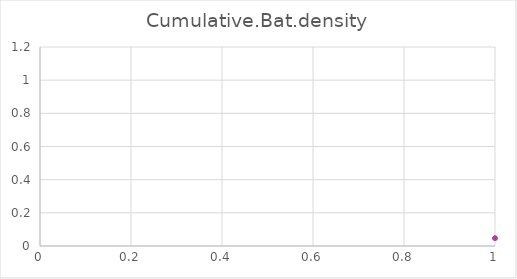
| Category | Cumulative.Bat.density |
|---|---|
| 0 | 0.047 |
| 1 | 0.091 |
| 2 | 0.132 |
| 3 | 0.171 |
| 4 | 0.206 |
| 5 | 0.239 |
| 6 | 0.269 |
| 7 | 0.297 |
| 8 | 0.323 |
| 9 | 0.347 |
| 10 | 0.369 |
| 11 | 0.389 |
| 12 | 0.408 |
| 13 | 0.425 |
| 14 | 0.442 |
| 15 | 0.457 |
| 16 | 0.471 |
| 17 | 0.485 |
| 18 | 0.498 |
| 19 | 0.511 |
| 20 | 0.523 |
| 21 | 0.536 |
| 22 | 0.548 |
| 23 | 0.56 |
| 24 | 0.573 |
| 25 | 0.586 |
| 26 | 0.599 |
| 27 | 0.612 |
| 28 | 0.626 |
| 29 | 0.641 |
| 30 | 0.656 |
| 31 | 0.671 |
| 32 | 0.687 |
| 33 | 0.703 |
| 34 | 0.719 |
| 35 | 0.734 |
| 36 | 0.749 |
| 37 | 0.764 |
| 38 | 0.777 |
| 39 | 0.79 |
| 40 | 0.802 |
| 41 | 0.812 |
| 42 | 0.822 |
| 43 | 0.83 |
| 44 | 0.838 |
| 45 | 0.846 |
| 46 | 0.853 |
| 47 | 0.859 |
| 48 | 0.866 |
| 49 | 0.872 |
| 50 | 0.878 |
| 51 | 0.884 |
| 52 | 0.89 |
| 53 | 0.896 |
| 54 | 0.902 |
| 55 | 0.908 |
| 56 | 0.914 |
| 57 | 0.919 |
| 58 | 0.925 |
| 59 | 0.93 |
| 60 | 0.935 |
| 61 | 0.939 |
| 62 | 0.944 |
| 63 | 0.948 |
| 64 | 0.952 |
| 65 | 0.955 |
| 66 | 0.959 |
| 67 | 0.962 |
| 68 | 0.965 |
| 69 | 0.968 |
| 70 | 0.971 |
| 71 | 0.973 |
| 72 | 0.976 |
| 73 | 0.978 |
| 74 | 0.98 |
| 75 | 0.981 |
| 76 | 0.983 |
| 77 | 0.985 |
| 78 | 0.986 |
| 79 | 0.987 |
| 80 | 0.989 |
| 81 | 0.99 |
| 82 | 0.991 |
| 83 | 0.992 |
| 84 | 0.993 |
| 85 | 0.994 |
| 86 | 0.995 |
| 87 | 0.996 |
| 88 | 0.996 |
| 89 | 0.997 |
| 90 | 0.998 |
| 91 | 0.998 |
| 92 | 0.999 |
| 93 | 0.999 |
| 94 | 0.999 |
| 95 | 1 |
| 96 | 1 |
| 97 | 1 |
| 98 | 1 |